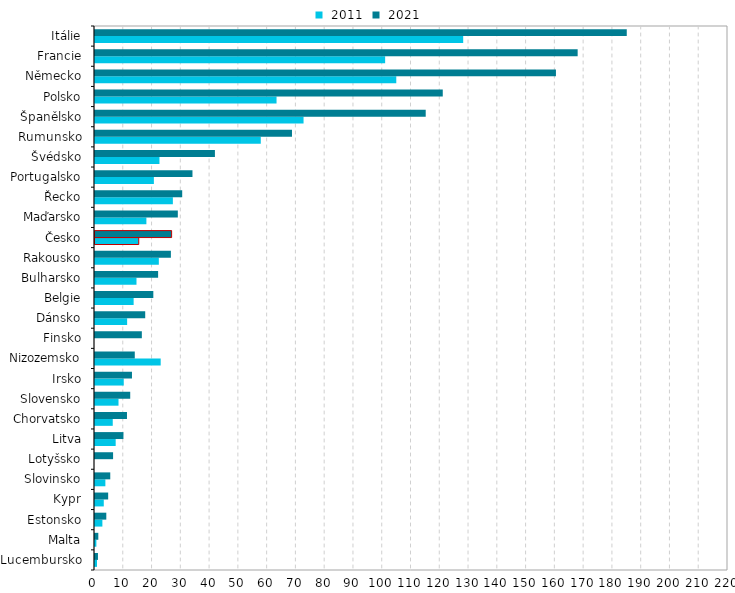
| Category |  2011 |  2021 |
|---|---|---|
| Lucembursko | 0.688 | 1.028 |
| Malta | 0.48 | 1.152 |
| Estonsko | 2.566 | 3.93 |
| Kypr | 3.049 | 4.577 |
| Slovinsko | 3.606 | 5.304 |
| Lotyšsko | 0 | 6.285 |
| Litva | 7.189 | 9.885 |
| Chorvatsko | 6.169 | 11.116 |
| Slovensko | 8.17 | 12.242 |
| Irsko | 9.99 | 12.849 |
| Nizozemsko | 22.832 | 13.825 |
| Finsko | 0 | 16.279 |
| Dánsko | 11.17 | 17.452 |
| Belgie | 13.429 | 20.271 |
| Bulharsko | 14.418 | 21.936 |
| Rakousko | 22.185 | 26.373 |
| Česko | 15.209 | 26.628 |
| Maďarsko | 17.86 | 28.785 |
| Řecko | 27.062 | 30.31 |
| Portugalsko | 20.462 | 33.875 |
| Švédsko | 22.402 | 41.679 |
| Rumunsko | 57.618 | 68.463 |
| Španělsko | 72.482 | 114.94 |
| Polsko | 63.094 | 120.866 |
| Německo | 104.71 | 160.2 |
| Francie | 100.839 | 167.749 |
| Itálie | 127.968 | 184.815 |